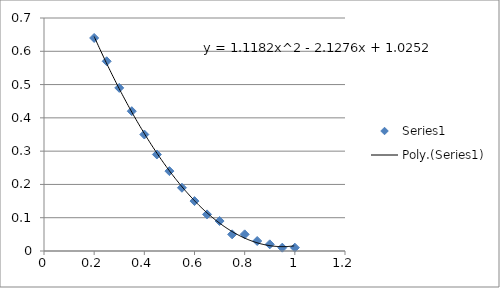
| Category | Series 0 |
|---|---|
| 0.2 | 0.64 |
| 0.25 | 0.57 |
| 0.3 | 0.49 |
| 0.35 | 0.42 |
| 0.4 | 0.35 |
| 0.45 | 0.29 |
| 0.5 | 0.24 |
| 0.55 | 0.19 |
| 0.6 | 0.15 |
| 0.65 | 0.11 |
| 0.7 | 0.09 |
| 0.75 | 0.05 |
| 0.8 | 0.05 |
| 0.85 | 0.03 |
| 0.9 | 0.02 |
| 0.95 | 0.01 |
| 1.0 | 0.01 |